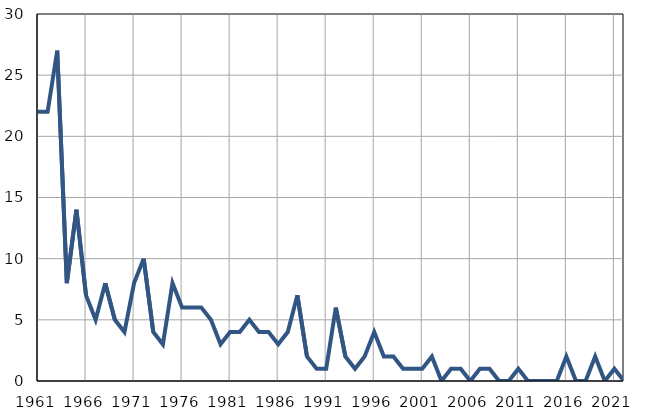
| Category | Infants
deaths |
|---|---|
| 1961.0 | 22 |
| 1962.0 | 22 |
| 1963.0 | 27 |
| 1964.0 | 8 |
| 1965.0 | 14 |
| 1966.0 | 7 |
| 1967.0 | 5 |
| 1968.0 | 8 |
| 1969.0 | 5 |
| 1970.0 | 4 |
| 1971.0 | 8 |
| 1972.0 | 10 |
| 1973.0 | 4 |
| 1974.0 | 3 |
| 1975.0 | 8 |
| 1976.0 | 6 |
| 1977.0 | 6 |
| 1978.0 | 6 |
| 1979.0 | 5 |
| 1980.0 | 3 |
| 1981.0 | 4 |
| 1982.0 | 4 |
| 1983.0 | 5 |
| 1984.0 | 4 |
| 1985.0 | 4 |
| 1986.0 | 3 |
| 1987.0 | 4 |
| 1988.0 | 7 |
| 1989.0 | 2 |
| 1990.0 | 1 |
| 1991.0 | 1 |
| 1992.0 | 6 |
| 1993.0 | 2 |
| 1994.0 | 1 |
| 1995.0 | 2 |
| 1996.0 | 4 |
| 1997.0 | 2 |
| 1998.0 | 2 |
| 1999.0 | 1 |
| 2000.0 | 1 |
| 2001.0 | 1 |
| 2002.0 | 2 |
| 2003.0 | 0 |
| 2004.0 | 1 |
| 2005.0 | 1 |
| 2006.0 | 0 |
| 2007.0 | 1 |
| 2008.0 | 1 |
| 2009.0 | 0 |
| 2010.0 | 0 |
| 2011.0 | 1 |
| 2012.0 | 0 |
| 2013.0 | 0 |
| 2014.0 | 0 |
| 2015.0 | 0 |
| 2016.0 | 2 |
| 2017.0 | 0 |
| 2018.0 | 0 |
| 2019.0 | 2 |
| 2020.0 | 0 |
| 2021.0 | 1 |
| 2022.0 | 0 |